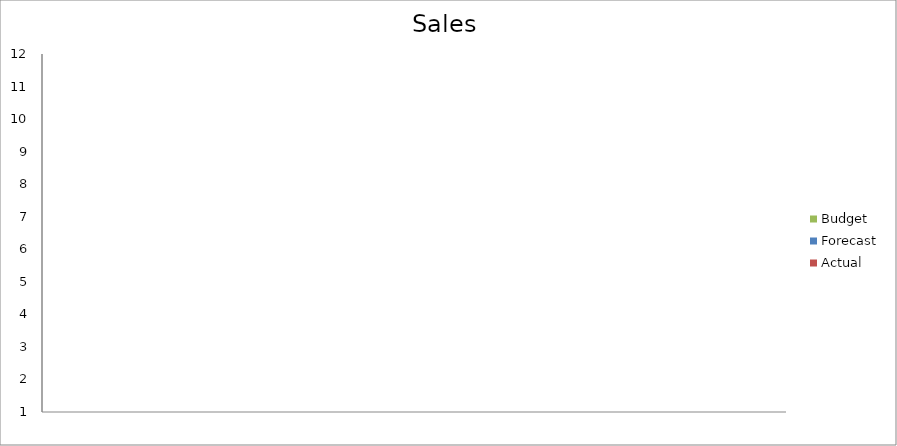
| Category | Budget | Forecast | Actual |
|---|---|---|---|
| 0 | 730 | 1670 | 690 |
| 1 | 2040 | 3270 | 3110 |
| 2 | 920 | 1110 | 980 |
| 3 | 1300 | 3470 | 2470 |
| 4 | 1610 | 3330 | 2420 |
| 5 | 1980 | 3010 | 3280 |
| 6 | 3160 | 1740 | 1770 |
| 7 | 3210 | 2700 | 1640 |
| 8 | 2690 | 1480 | 3200 |
| 9 | 2790 | 1610 | 840 |
| 10 | 2280 | 510 | 1600 |
| 11 | 2110 | 1450 | 2960 |